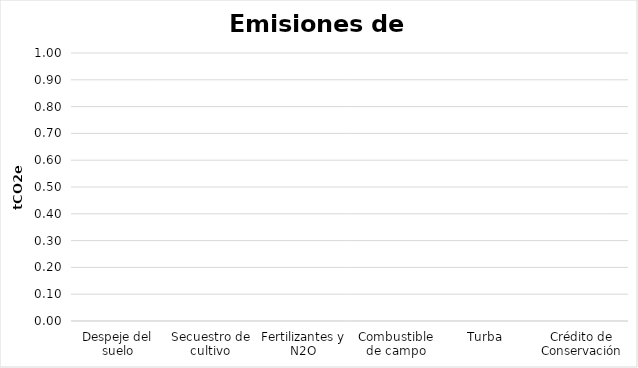
| Category | Series 0 |
|---|---|
| Despeje del suelo | 0 |
| Secuestro de cultivo | 0 |
| Fertilizantes y N2O | 0 |
| Combustible de campo | 0 |
| Turba  | 0 |
| Crédito de Conservación | 0 |